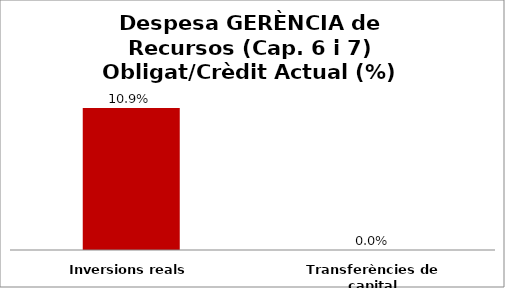
| Category | Series 0 |
|---|---|
| Inversions reals | 0.109 |
| Transferències de capital | 0 |